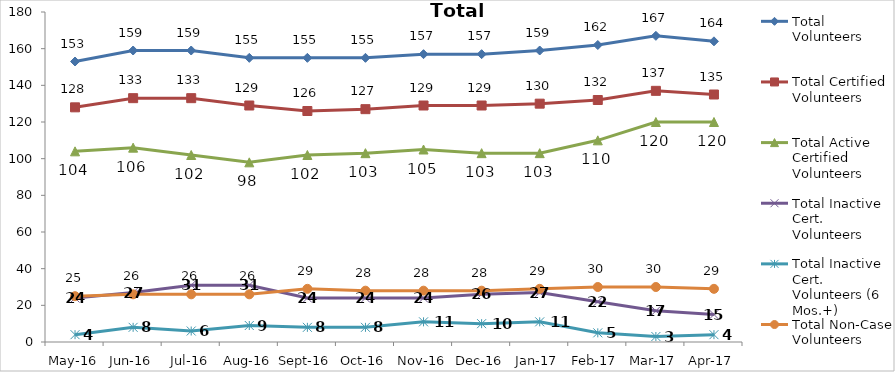
| Category | Total Volunteers | Total Certified Volunteers | Total Active Certified Volunteers | Total Inactive Cert. Volunteers | Total Inactive Cert. Volunteers (6 Mos.+) | Total Non-Case Volunteers |
|---|---|---|---|---|---|---|
| May-16 | 153 | 128 | 104 | 24 | 4 | 25 |
| Jun-16 | 159 | 133 | 106 | 27 | 8 | 26 |
| Jul-16 | 159 | 133 | 102 | 31 | 6 | 26 |
| Aug-16 | 155 | 129 | 98 | 31 | 9 | 26 |
| Sep-16 | 155 | 126 | 102 | 24 | 8 | 29 |
| Oct-16 | 155 | 127 | 103 | 24 | 8 | 28 |
| Nov-16 | 157 | 129 | 105 | 24 | 11 | 28 |
| Dec-16 | 157 | 129 | 103 | 26 | 10 | 28 |
| Jan-17 | 159 | 130 | 103 | 27 | 11 | 29 |
| Feb-17 | 162 | 132 | 110 | 22 | 5 | 30 |
| Mar-17 | 167 | 137 | 120 | 17 | 3 | 30 |
| Apr-17 | 164 | 135 | 120 | 15 | 4 | 29 |